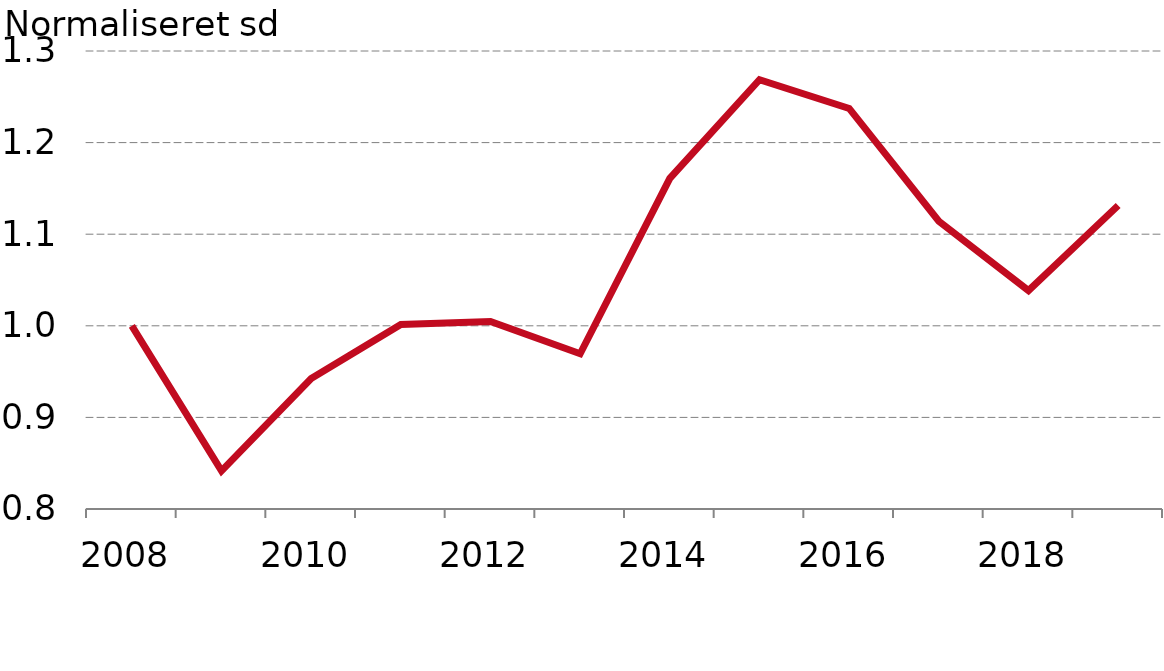
| Category |  Forbrug |
|---|---|
| 2008.0 | 1 |
| 2009.0 | 0.842 |
| 2010.0 | 0.943 |
| 2011.0 | 1.002 |
| 2012.0 | 1.005 |
| 2013.0 | 0.969 |
| 2014.0 | 1.161 |
| 2015.0 | 1.269 |
| 2016.0 | 1.237 |
| 2017.0 | 1.114 |
| 2018.0 | 1.038 |
| 2019.0 | 1.131 |